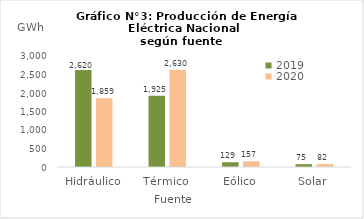
| Category | 2019 | 2020 |
|---|---|---|
| Hidráulico | 2619.716 | 1859.327 |
| Térmico | 1925.409 | 2629.744 |
| Eólico | 129.155 | 156.77 |
| Solar | 75.187 | 81.518 |